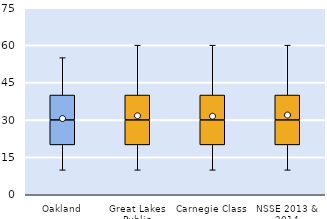
| Category | 25th | 50th | 75th |
|---|---|---|---|
| Oakland | 20 | 10 | 10 |
| Great Lakes Public | 20 | 10 | 10 |
| Carnegie Class | 20 | 10 | 10 |
| NSSE 2013 & 2014 | 20 | 10 | 10 |